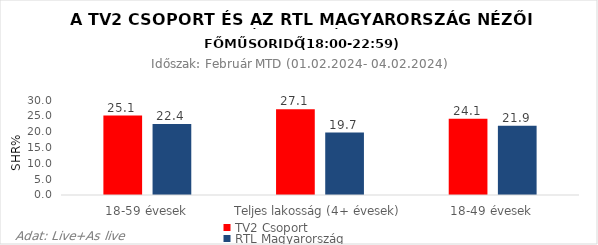
| Category | TV2 Csoport | RTL Magyarország |
|---|---|---|
| 18-59 évesek | 25.1 | 22.4 |
| Teljes lakosság (4+ évesek) | 27.1 | 19.7 |
| 18-49 évesek | 24.1 | 21.9 |